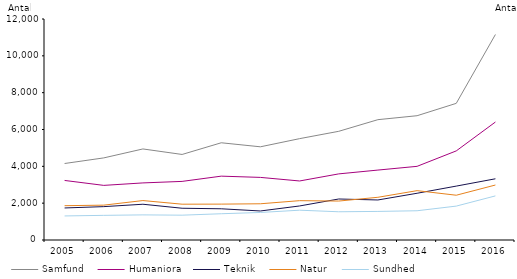
| Category | Samfund | Humaniora | Teknik | Natur | Sundhed |
|---|---|---|---|---|---|
| 2005.0 | 4153 | 3234 | 1740 | 1863 | 1306 |
| 2006.0 | 4458 | 2966 | 1812 | 1892 | 1338 |
| 2007.0 | 4944 | 3100 | 1942 | 2142 | 1364 |
| 2008.0 | 4645 | 3182 | 1724 | 1944 | 1348 |
| 2009.0 | 5279 | 3467 | 1695 | 1948 | 1426 |
| 2010.0 | 5060 | 3399 | 1576 | 1967 | 1495 |
| 2011.0 | 5503 | 3205 | 1848 | 2136 | 1618 |
| 2012.0 | 5902 | 3590 | 2227 | 2115 | 1533 |
| 2013.0 | 6534 | 3797 | 2173 | 2319 | 1552 |
| 2014.0 | 6749 | 4000 | 2538 | 2680 | 1588 |
| 2015.0 | 7420 | 4838 | 2927 | 2431 | 1841 |
| 2016.0 | 11158 | 6406 | 3324 | 2985 | 2395 |